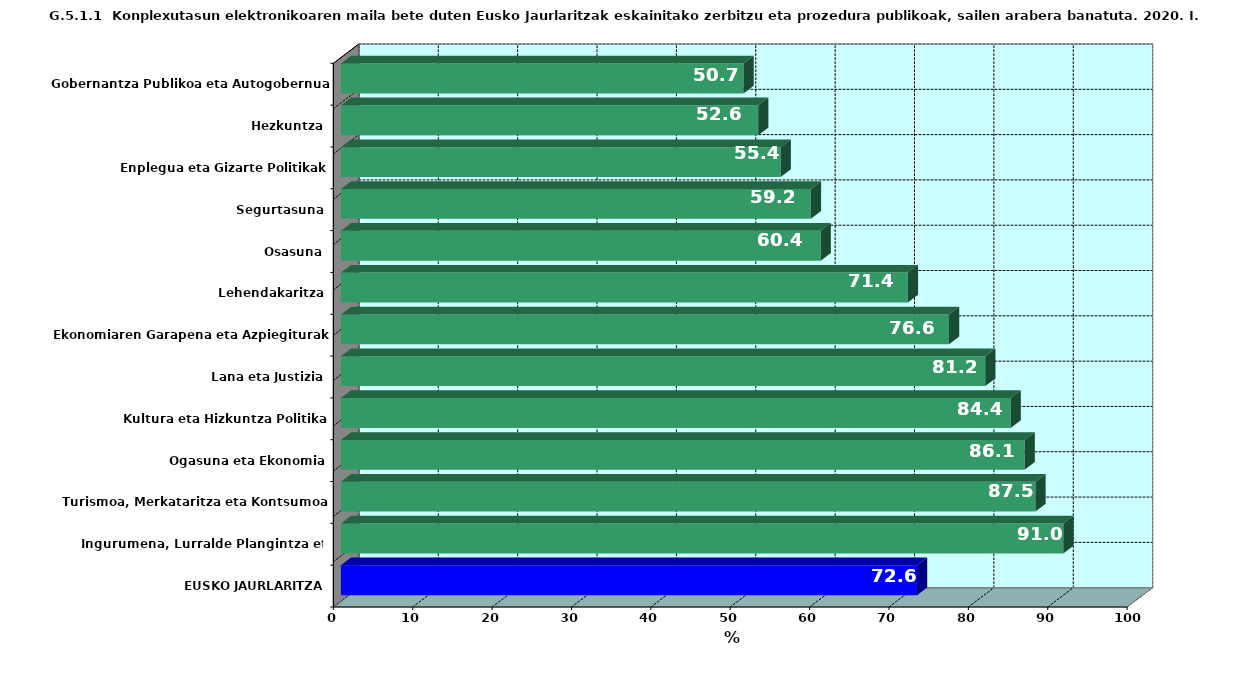
| Category | Series 0 |
|---|---|
| EUSKO JAURLARITZA | 72.578 |
| Ingurumena, Lurralde Plangintza eta Etxebizitza | 91.016 |
| Turismoa, Merkataritza eta Kontsumoa | 87.5 |
| Ogasuna eta Ekonomia | 86.139 |
| Kultura eta Hizkuntza Politika | 84.375 |
| Lana eta Justizia | 81.176 |
| Ekonomiaren Garapena eta Azpiegiturak | 76.613 |
| Lehendakaritza | 71.429 |
| Osasuna | 60.44 |
| Segurtasuna | 59.211 |
| Enplegua eta Gizarte Politikak | 55.405 |
| Hezkuntza | 52.571 |
| Gobernantza Publikoa eta Autogobernua | 50.725 |